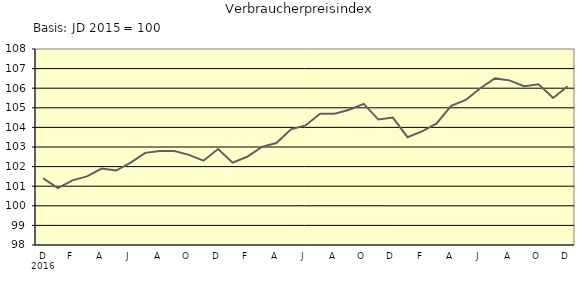
| Category | Series 0 |
|---|---|
| 0 | 101.4 |
| 1 | 100.9 |
| 2 | 101.3 |
| 3 | 101.5 |
| 4 | 101.9 |
| 5 | 101.8 |
| 6 | 102.2 |
| 7 | 102.7 |
| 8 | 102.8 |
| 9 | 102.8 |
| 10 | 102.6 |
| 11 | 102.3 |
| 12 | 102.9 |
| 13 | 102.2 |
| 14 | 102.5 |
| 15 | 103 |
| 16 | 103.2 |
| 17 | 103.9 |
| 18 | 104.1 |
| 19 | 104.7 |
| 20 | 104.7 |
| 21 | 104.9 |
| 22 | 105.2 |
| 23 | 104.4 |
| 24 | 104.5 |
| 25 | 103.5 |
| 26 | 103.8 |
| 27 | 104.2 |
| 28 | 105.1 |
| 29 | 105.4 |
| 30 | 106 |
| 31 | 106.5 |
| 32 | 106.4 |
| 33 | 106.1 |
| 34 | 106.2 |
| 35 | 105.5 |
| 36 | 106.1 |